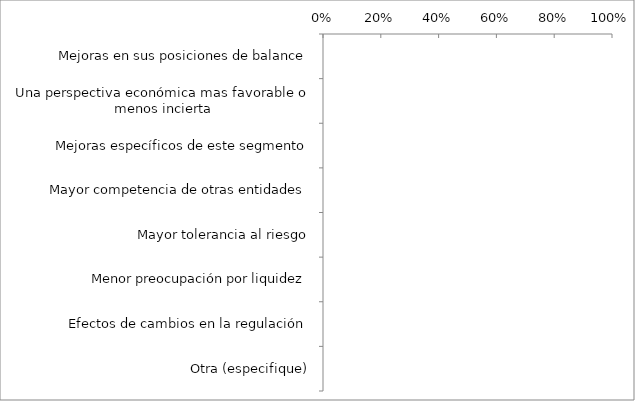
| Category | Series 0 | Series 1 |
|---|---|---|
| Mejoras en sus posiciones de balance |  | 0 |
| Una perspectiva económica mas favorable o menos incierta |  | 0 |
| Mejoras específicos de este segmento |  | 0 |
| Mayor competencia de otras entidades |  | 0 |
| Mayor tolerancia al riesgo |  | 0 |
| Menor preocupación por liquidez |  | 0 |
| Efectos de cambios en la regulación |  | 0 |
| Otra (especifique) |  | 0 |